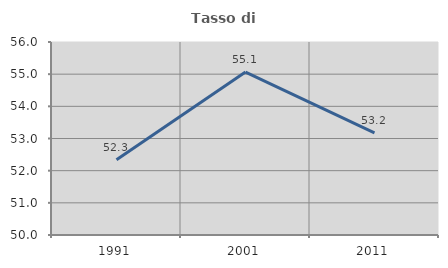
| Category | Tasso di occupazione   |
|---|---|
| 1991.0 | 52.337 |
| 2001.0 | 55.066 |
| 2011.0 | 53.177 |